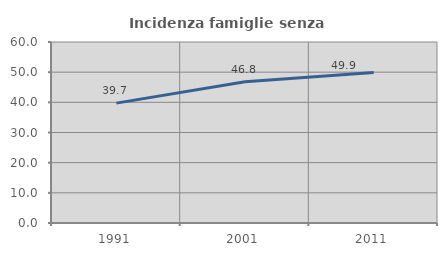
| Category | Incidenza famiglie senza nuclei |
|---|---|
| 1991.0 | 39.736 |
| 2001.0 | 46.847 |
| 2011.0 | 49.868 |